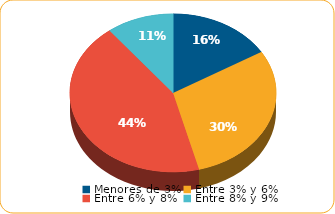
| Category | Series 0 |
|---|---|
| Menores de 3% | 2073.4 |
| Entre 3% y 6% | 3751.7 |
| Entre 6% y 8% | 5516.5 |
| Entre 8% y 9% | 1337.7 |